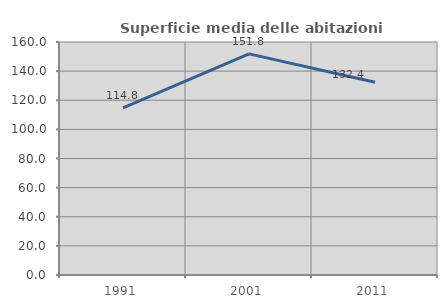
| Category | Superficie media delle abitazioni occupate |
|---|---|
| 1991.0 | 114.773 |
| 2001.0 | 151.84 |
| 2011.0 | 132.413 |